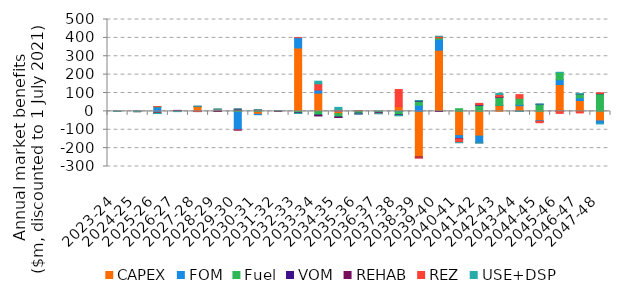
| Category | CAPEX | FOM | Fuel | VOM | REHAB | REZ | USE+DSP |
|---|---|---|---|---|---|---|---|
| 2023-24 | -0.105 | -0.016 | 0.106 | 0.055 | 0 | -0.003 | 0.008 |
| 2024-25 | -1.178 | -0.202 | 0.734 | 0.031 | 0 | 0 | -0.012 |
| 2025-26 | -9.1 | 23.826 | 2.007 | -0.15 | -1.098 | 0 | -1.639 |
| 2026-27 | 4.374 | -0.835 | 0.528 | 0.033 | 0.26 | 0 | -0.546 |
| 2027-28 | 25.762 | -0.638 | 1.389 | -0.367 | 0.503 | 0 | 0.01 |
| 2028-29 | 8.253 | 1.62 | 1.843 | -0.222 | 0 | 0.006 | 1.358 |
| 2029-30 | -1.375 | -99.98 | 6.341 | -0.046 | 6.579 | 0 | 0.143 |
| 2030-31 | -15.84 | -2.279 | 7.053 | 0.154 | 0.014 | 0.87 | 0.636 |
| 2031-32 | -0.006 | -0.001 | 3.003 | 0.294 | 0 | 0.199 | 0.011 |
| 2032-33 | 345.086 | 56.002 | -7.786 | -2.824 | 0 | 0.034 | -0.684 |
| 2033-34 | 99.456 | 16.753 | -19.843 | -4.069 | 0 | 33.879 | 14.083 |
| 2034-35 | -12.826 | 1.408 | -17.524 | -2.891 | 0 | 6.922 | 13.566 |
| 2035-36 | 0.331 | 3.338 | -10.095 | -3.308 | 0 | 0.06 | -0.768 |
| 2036-37 | -1.479 | 1.457 | -6.143 | -2.944 | 0 | -1.625 | -0.751 |
| 2037-38 | 24.894 | -2.584 | -15.883 | -3.182 | 0 | 93.996 | -2.489 |
| 2038-39 | -248.129 | 33.337 | 21.432 | 2.844 | -4.85 | -0.744 | 0.203 |
| 2039-40 | 333.067 | 58.906 | 7.703 | -0.363 | 0 | 8.501 | 0.453 |
| 2040-41 | -132.147 | -15.996 | 14.597 | -1.911 | 0 | -19.699 | -0.803 |
| 2041-42 | -134.513 | -36.006 | 33.245 | 3.051 | 0 | 7.259 | -2.079 |
| 2042-43 | 32.781 | 0.859 | 43.669 | 2.314 | 0.096 | 12.094 | 6.086 |
| 2043-44 | 30.648 | 7.154 | 33.417 | -0.043 | 0 | 19.754 | -0.379 |
| 2044-45 | -51.056 | -3.595 | 37.081 | 2.117 | -0.168 | -6.965 | 0.827 |
| 2045-46 | 146.026 | 26.418 | 39.497 | -0.422 | 0 | -10.542 | 0.541 |
| 2046-47 | 58.903 | 15.083 | 19.668 | 0.078 | 0 | -8.51 | 3.571 |
| 2047-48 | -52.132 | -15.228 | 95.867 | 1.991 | 0 | 2.673 | -0.016 |